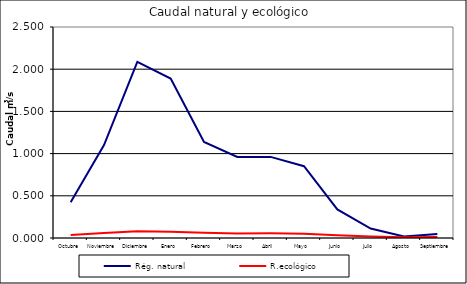
| Category | Rég. natural | R.ecológico |
|---|---|---|
| Octubre | 0.424 | 0.036 |
| Noviembre | 1.101 | 0.058 |
| Diciembre | 2.087 | 0.079 |
| Enero | 1.89 | 0.075 |
| Febrero | 1.138 | 0.061 |
| Marzo | 0.961 | 0.054 |
| Abril | 0.961 | 0.055 |
| Mayo | 0.851 | 0.051 |
| Junio | 0.339 | 0.032 |
| Julio | 0.112 | 0.018 |
| Agosto | 0.019 | 0.008 |
| Septiembre | 0.048 | 0.012 |